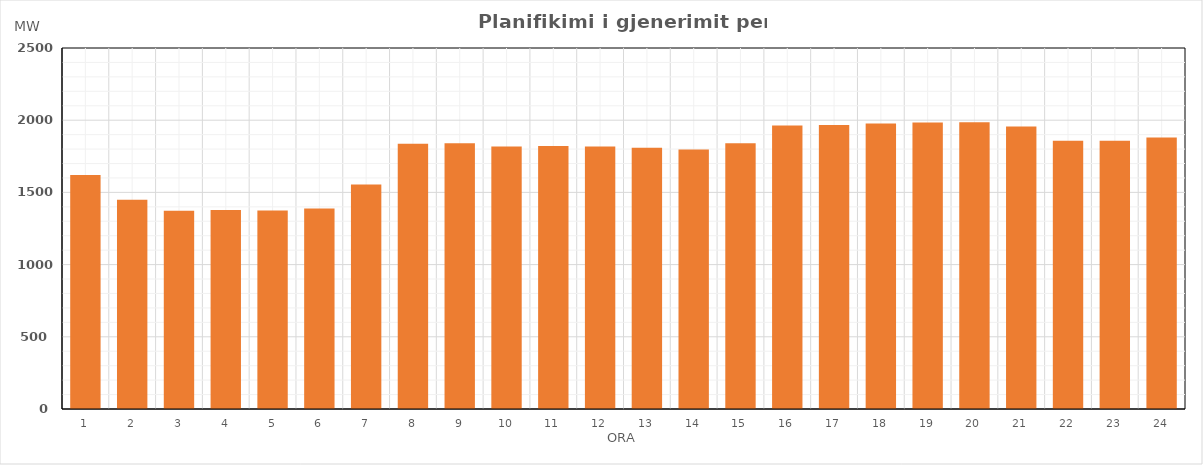
| Category | Max (MW) |
|---|---|
| 0 | 1619.815 |
| 1 | 1449.448 |
| 2 | 1372.997 |
| 3 | 1378.961 |
| 4 | 1374.941 |
| 5 | 1389.038 |
| 6 | 1554.984 |
| 7 | 1836.86 |
| 8 | 1840.002 |
| 9 | 1817.875 |
| 10 | 1821.843 |
| 11 | 1817.831 |
| 12 | 1808.733 |
| 13 | 1797.874 |
| 14 | 1841.027 |
| 15 | 1963.11 |
| 16 | 1965.961 |
| 17 | 1977.047 |
| 18 | 1983.216 |
| 19 | 1985.071 |
| 20 | 1957.091 |
| 21 | 1858.274 |
| 22 | 1856.938 |
| 23 | 1880.962 |